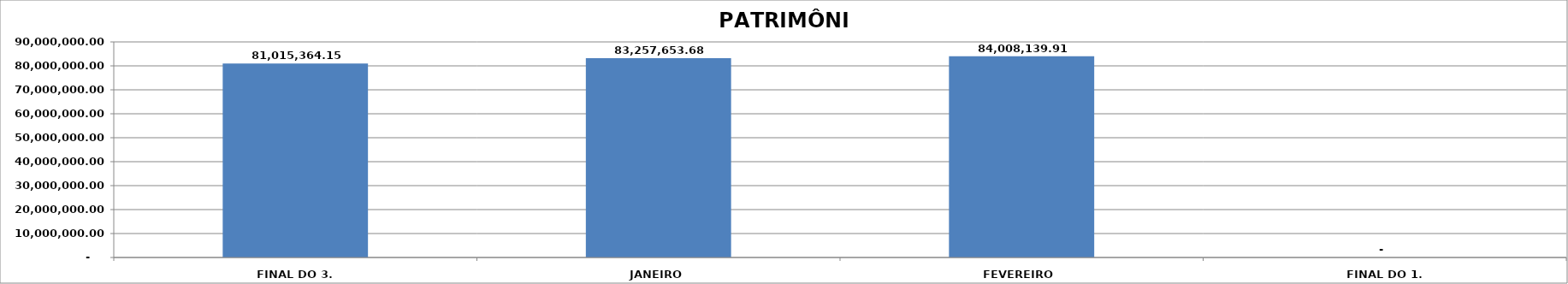
| Category | SALDO |
|---|---|
| FINAL DO 3. TRIMESTRE | 81015364.15 |
| JANEIRO | 83257653.68 |
| FEVEREIRO | 84008139.91 |
| FINAL DO 1. TRIMESTRE | 0 |